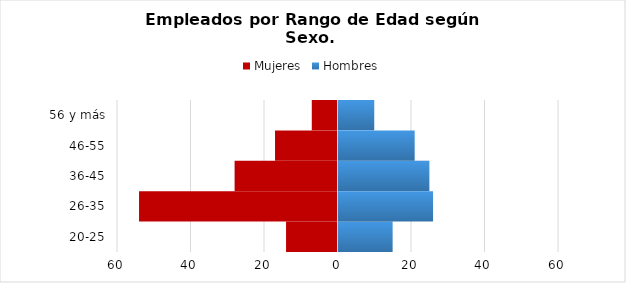
| Category | Mujeres | Hombres |
|---|---|---|
| 20-25 | -14 | 15 |
| 26-35 | -54 | 26 |
| 36-45 | -28 | 25 |
| 46-55 | -17 | 21 |
| 56 y más | -7 | 10 |